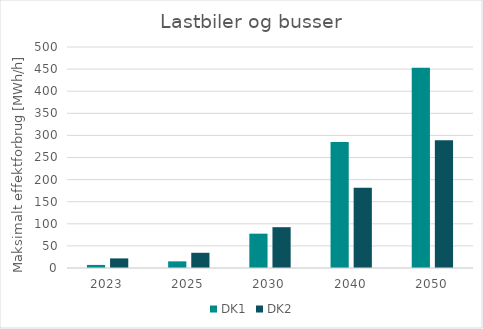
| Category | DK1 | DK2 |
|---|---|---|
| 2023.0 | 6.964 | 21.729 |
| 2025.0 | 15.022 | 34.435 |
| 2030.0 | 77.672 | 92.339 |
| 2040.0 | 284.916 | 181.537 |
| 2050.0 | 453.257 | 288.797 |